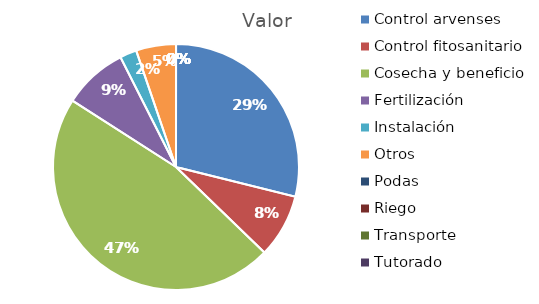
| Category | Valor |
|---|---|
| Control arvenses | 14020533.333 |
| Control fitosanitario | 4057200 |
| Cosecha y beneficio | 22740852 |
| Fertilización | 4116000 |
| Instalación | 1071466.667 |
| Otros | 2548000 |
| Podas | 0 |
| Riego | 0 |
| Transporte | 0 |
| Tutorado | 0 |